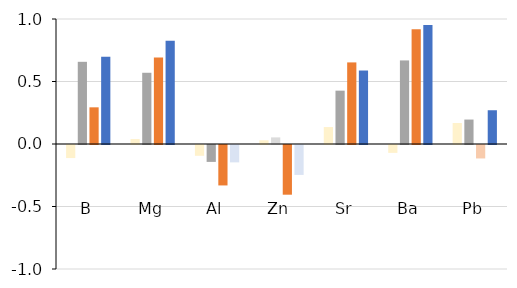
| Category | FO | IOM | ICE | GOM |
|---|---|---|---|---|
| B | -0.104 | 0.657 | 0.293 | 0.697 |
| Mg | 0.039 | 0.57 | 0.692 | 0.826 |
| Al | -0.086 | -0.135 | -0.323 | -0.139 |
| Zn | 0.03 | 0.053 | -0.398 | -0.239 |
| Sr | 0.135 | 0.427 | 0.653 | 0.588 |
| Ba | -0.063 | 0.669 | 0.918 | 0.951 |
| Pb | 0.168 | 0.196 | -0.108 | 0.27 |